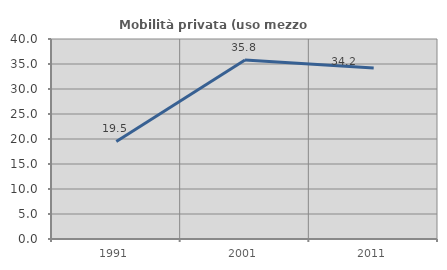
| Category | Mobilità privata (uso mezzo privato) |
|---|---|
| 1991.0 | 19.512 |
| 2001.0 | 35.811 |
| 2011.0 | 34.188 |